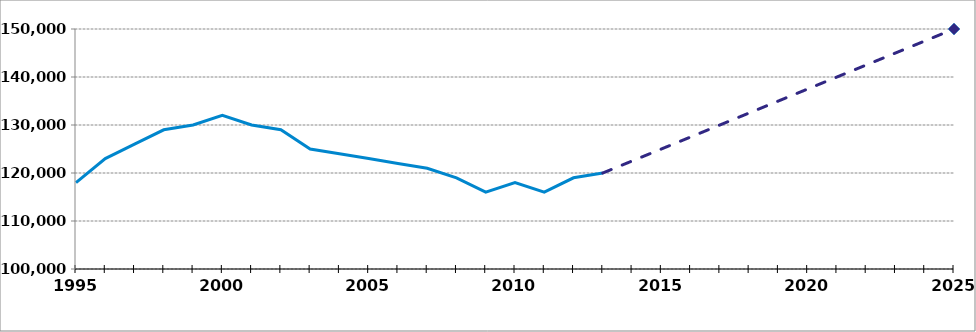
| Category | Nombre d'entreprises exportatrices |
|---|---|
| 1995.0 | 118000 |
| nan | 123000 |
| nan | 126000 |
| nan | 129000 |
| nan | 130000 |
| 2000.0 | 132000 |
| nan | 130000 |
| nan | 129000 |
| nan | 125000 |
| nan | 124000 |
| 2005.0 | 123000 |
| nan | 122000 |
| nan | 121000 |
| nan | 119000 |
| nan | 116000 |
| 2010.0 | 118000 |
| nan | 116000 |
| nan | 119000 |
| 2013.0 | 120000 |
| 2014.0 | 122500 |
| 2015.0 | 125000 |
| 2016.0 | 127500 |
| 2017.0 | 130000 |
| 2018.0 | 132500 |
| 2019.0 | 135000 |
| 2020.0 | 137500 |
| 2021.0 | 140000 |
| 2022.0 | 142500 |
| 2023.0 | 145000 |
| 2024.0 | 147500 |
| 2025.0 | 150000 |